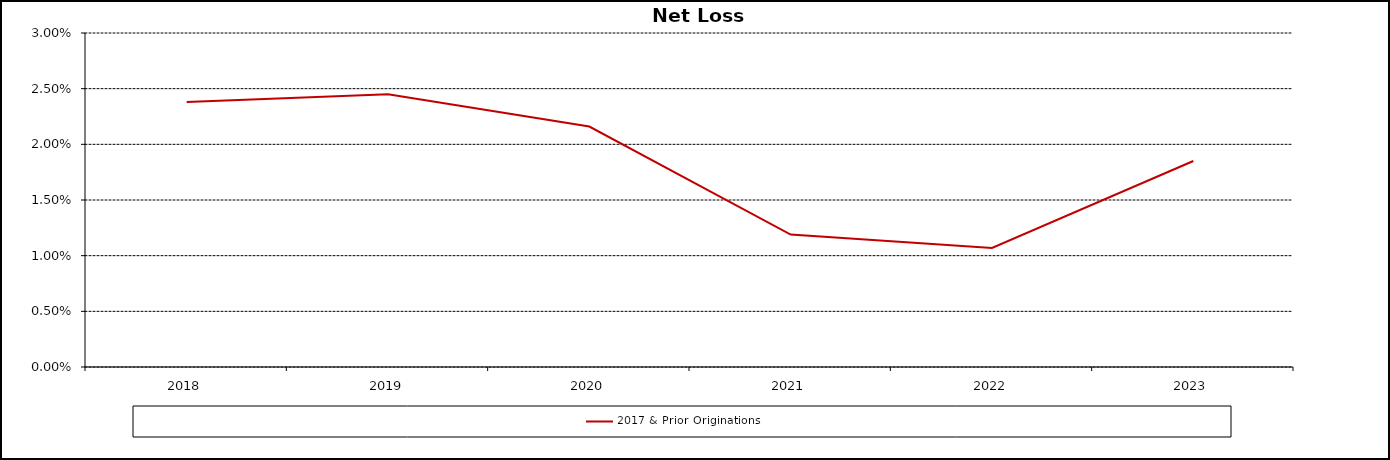
| Category | 2017 & Prior Originations |
|---|---|
| 2018 | 0.024 |
| 2019 | 0.024 |
| 2020 | 0.022 |
| 2021 | 0.012 |
| 2022 | 0.011 |
|  2023  | 0.018 |